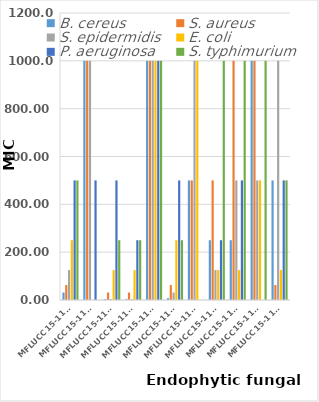
| Category | B. cereus | S. aureus | S. epidermidis | E. coli | P. aeruginosa | S. typhimurium |
|---|---|---|---|---|---|---|
|  MFLUCC15-1112 | 31.25 | 62.5 | 125 | 250 | 500 | 500 |
|  MFLUCC15-1113 | 1000 | 1000 | 1000 | 0 | 500 | 0 |
| MFLUCC15-1130 | 3.91 | 31.25 | 3.91 | 125 | 500 | 250 |
| MFLUCC15-1131 | 3.91 | 31.25 | 3.91 | 125 | 250 | 250 |
| MFLUCC15-1132 | 1000 | 1000 | 1000 | 1000 | 1000 | 1000 |
| MFLUCC15-1133 | 7.81 | 62.5 | 31.25 | 250 | 500 | 250 |
| MFLUCC15-1134 | 500 | 500 | 1000 | 1000 | 0 | 0 |
| MFLUCC15-1135 | 250 | 500 | 125 | 125 | 250 | 1000 |
|  MFLUCC15-1136 | 250 | 1000 | 500 | 125 | 500 | 1000 |
|  MFLUCC15-1137 | 1000 | 1000 | 500 | 500 | 0 | 1000 |
|  MFLUCC15-1138 | 500 | 62.5 | 1000 | 125 | 500 | 500 |